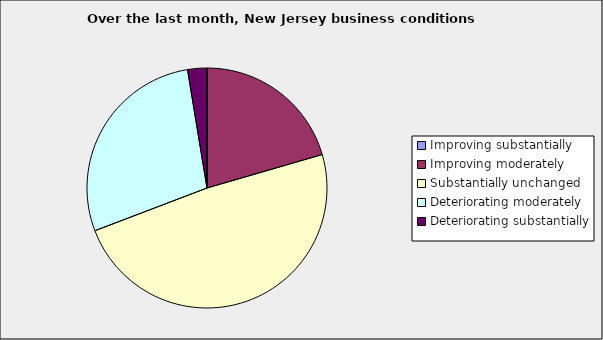
| Category | Series 0 |
|---|---|
| Improving substantially | 0 |
| Improving moderately | 0.205 |
| Substantially unchanged | 0.487 |
| Deteriorating moderately | 0.282 |
| Deteriorating substantially | 0.026 |